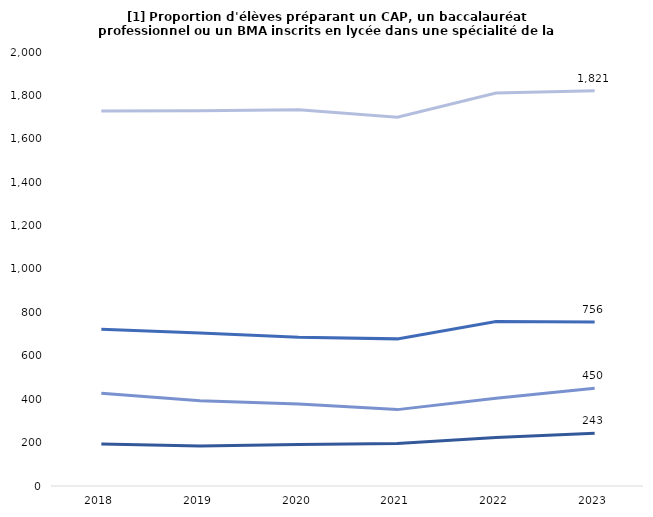
| Category | Effectif CAP prod | Effectif Bac pro prod | Effectif CAP total | Effectif Bac pro total |
|---|---|---|---|---|
| 2018 | 193 | 722 | 427 | 1728 |
| 2019 | 184 | 705 | 393 | 1729 |
| 2020 | 191 | 686 | 378 | 1734 |
| 2021 | 196 | 678 | 352 | 1699 |
| 2022 | 224 | 758 | 404 | 1811 |
| 2023 | 243 | 756 | 450 | 1821 |